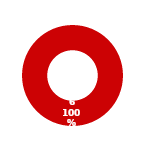
| Category | PRIVACY |
|---|---|
| MIL 3 Complete | 0 |
| MIL 3 Not Complete | 6 |